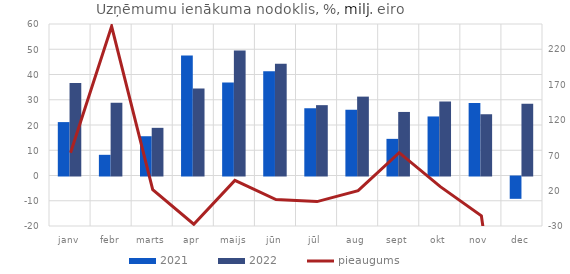
| Category | 2021 | 2022 |
|---|---|---|
| janv | 21.151 | 36.646 |
| febr | 8.191 | 28.808 |
| marts | 15.553 | 18.876 |
| apr | 47.547 | 34.443 |
| maijs | 36.816 | 49.467 |
| jūn | 41.259 | 44.263 |
| jūl | 26.677 | 27.86 |
| aug | 26.08 | 31.241 |
| sept | 14.513 | 25.169 |
| okt | 23.385 | 29.346 |
| nov | 28.751 | 24.259 |
| dec | -8.843 | 28.372 |